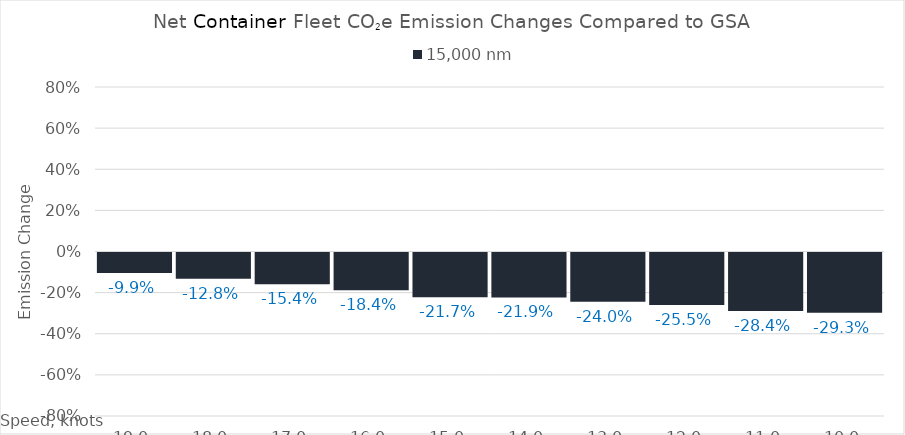
| Category | 15,000 |
|---|---|
| 19.0 | -0.099 |
| 18.0 | -0.128 |
| 17.0 | -0.154 |
| 16.0 | -0.184 |
| 15.0 | -0.217 |
| 14.0 | -0.219 |
| 13.0 | -0.24 |
| 12.0 | -0.255 |
| 11.0 | -0.284 |
| 10.0 | -0.293 |